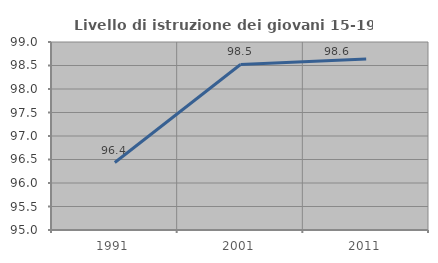
| Category | Livello di istruzione dei giovani 15-19 anni |
|---|---|
| 1991.0 | 96.436 |
| 2001.0 | 98.522 |
| 2011.0 | 98.64 |